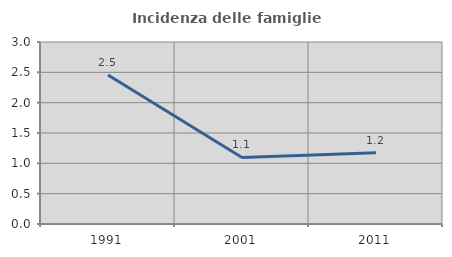
| Category | Incidenza delle famiglie numerose |
|---|---|
| 1991.0 | 2.455 |
| 2001.0 | 1.096 |
| 2011.0 | 1.176 |